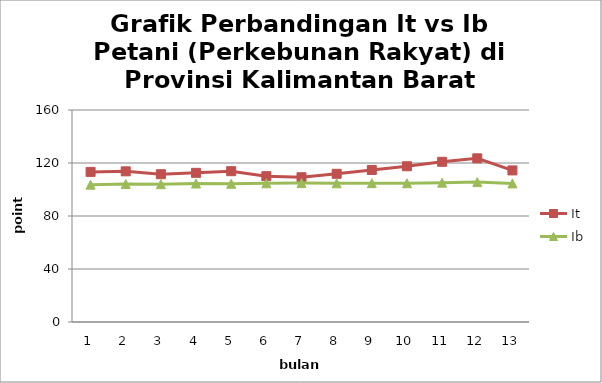
| Category | It | Ib |
|---|---|---|
| 0 | 113.28 | 103.64 |
| 1 | 113.72 | 104.14 |
| 2 | 111.54 | 104 |
| 3 | 112.56 | 104.54 |
| 4 | 113.82 | 104.32 |
| 5 | 110.07 | 104.68 |
| 6 | 109.25 | 104.89 |
| 7 | 111.86 | 104.68 |
| 8 | 114.76 | 104.78 |
| 9 | 117.54 | 104.72 |
| 10 | 120.91 | 105.16 |
| 11 | 123.53 | 105.58 |
| 12 | 114.403 | 104.594 |